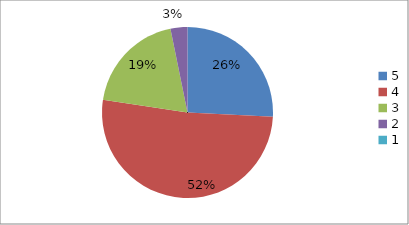
| Category | Series 0 | Series 1 |
|---|---|---|
| 5.0 | 25.8 | 25.8 |
| 4.0 | 51.6 | 51.6 |
| 3.0 | 19.4 | 19.4 |
| 2.0 | 3.2 | 3.2 |
| 1.0 | 0 | 0 |